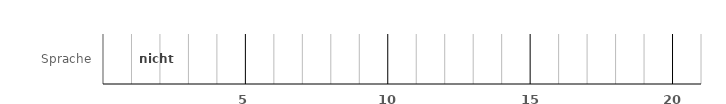
| Category | nicht empfohlen |
|---|---|
| Sprache | 0 |